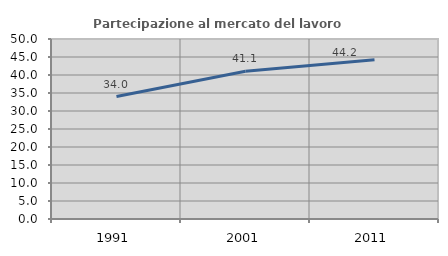
| Category | Partecipazione al mercato del lavoro  femminile |
|---|---|
| 1991.0 | 34.014 |
| 2001.0 | 41.051 |
| 2011.0 | 44.223 |